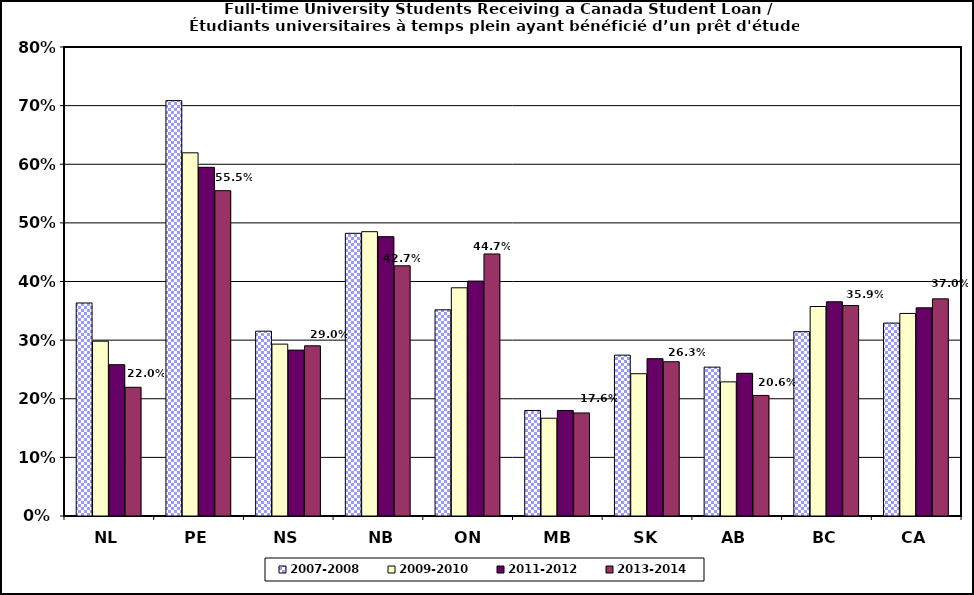
| Category | 2007-2008 | 2009-2010 | 2011-2012 | 2013-2014 |
|---|---|---|---|---|
| NL | 0.363 | 0.298 | 0.258 | 0.22 |
| PE | 0.709 | 0.619 | 0.595 | 0.555 |
| NS | 0.315 | 0.293 | 0.283 | 0.29 |
| NB | 0.482 | 0.485 | 0.476 | 0.427 |
| ON | 0.352 | 0.389 | 0.401 | 0.447 |
| MB | 0.18 | 0.167 | 0.18 | 0.176 |
| SK | 0.274 | 0.243 | 0.268 | 0.263 |
| AB | 0.254 | 0.229 | 0.243 | 0.206 |
| BC | 0.314 | 0.357 | 0.365 | 0.359 |
| CA | 0.329 | 0.346 | 0.355 | 0.37 |